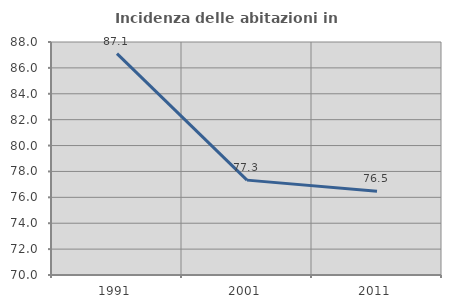
| Category | Incidenza delle abitazioni in proprietà  |
|---|---|
| 1991.0 | 87.097 |
| 2001.0 | 77.329 |
| 2011.0 | 76.471 |